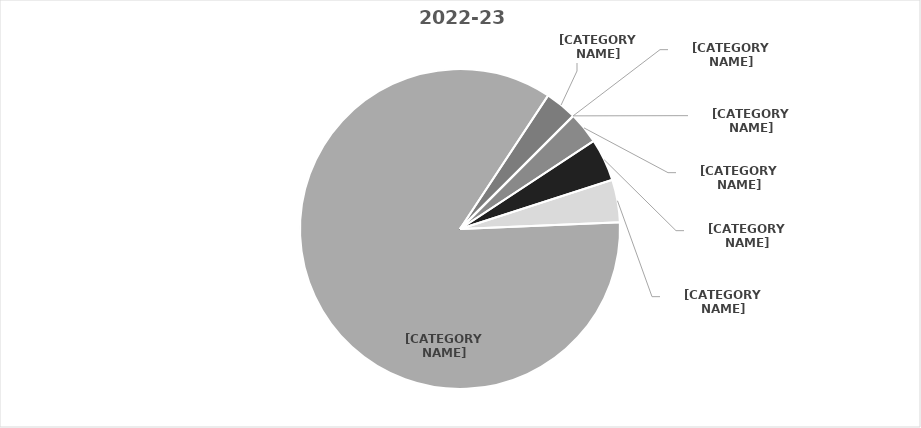
| Category | 2022-23 |
|---|---|
| Domestic Not Supplied | 0 |
| American Indian/ Alaskan Native | 0 |
| African American/ Non Hispanic | 3 |
| Asian/ Asian American** | 4 |
| Hispanic/ Hispanic American | 4 |
| White/ Non Hispanic | 79 |
| Multi Racial | 3 |